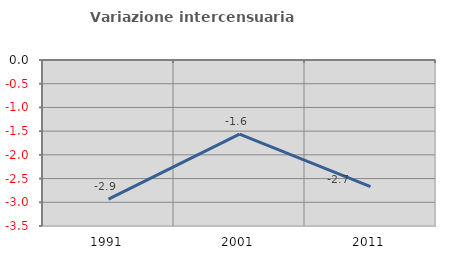
| Category | Variazione intercensuaria annua |
|---|---|
| 1991.0 | -2.935 |
| 2001.0 | -1.565 |
| 2011.0 | -2.671 |